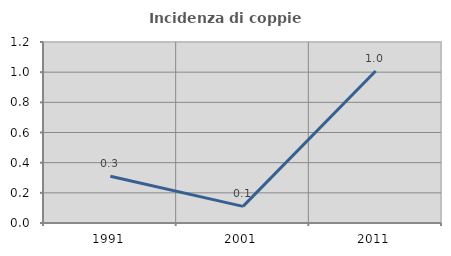
| Category | Incidenza di coppie miste |
|---|---|
| 1991.0 | 0.31 |
| 2001.0 | 0.11 |
| 2011.0 | 1.008 |